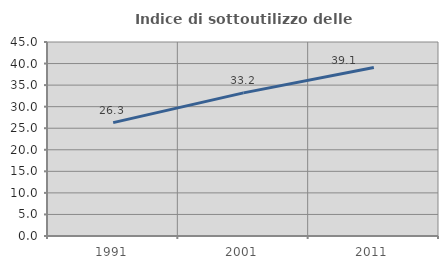
| Category | Indice di sottoutilizzo delle abitazioni  |
|---|---|
| 1991.0 | 26.294 |
| 2001.0 | 33.203 |
| 2011.0 | 39.071 |